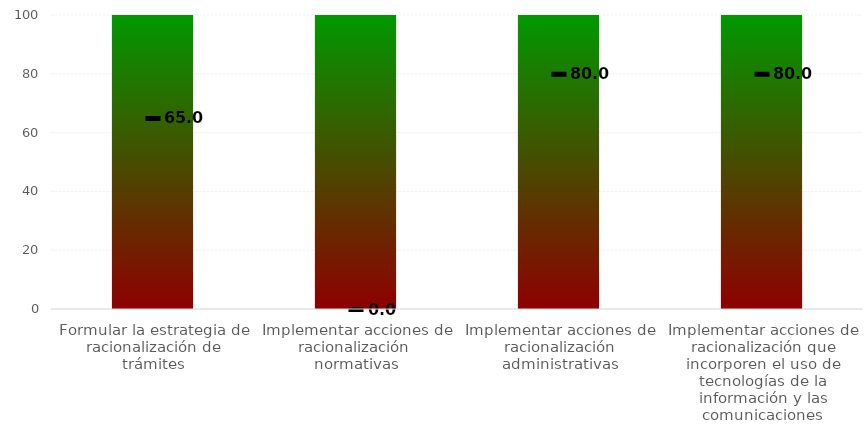
| Category | Niveles |
|---|---|
| Formular la estrategia de racionalización de trámites | 100 |
| Implementar acciones de racionalización  normativas | 100 |
| Implementar acciones de racionalización administrativas | 100 |
| Implementar acciones de racionalización que incorporen el uso de tecnologías de la información y las comunicaciones | 100 |